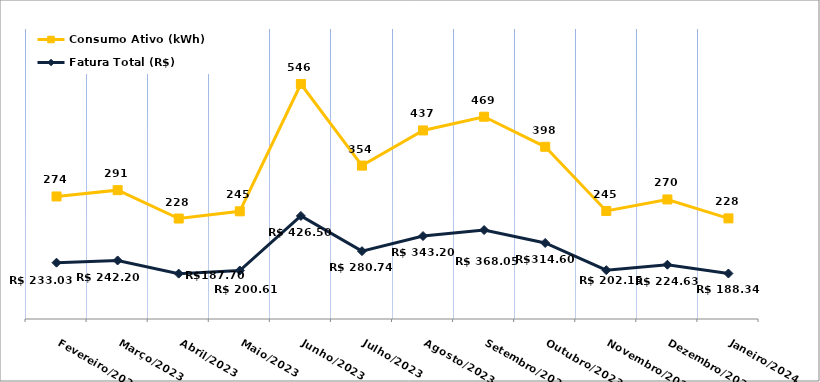
| Category | Fatura Total (R$) | Consumo Ativo (kWh) |
|---|---|---|
| Fevereiro/2023 | 233.03 | 274 |
| Março/2023 | 242.2 | 291 |
| Abril/2023 | 187.7 | 228 |
| Maio/2023 | 200.61 | 245 |
| Junho/2023 | 426.5 | 546 |
| Julho/2023 | 280.74 | 354 |
| Agosto/2023 | 343.2 | 437 |
| Setembro/2023 | 368.05 | 469 |
| Outubro/2023 | 314.6 | 398 |
| Novembro/2023 | 202.15 | 245 |
| Dezembro/2023 | 224.63 | 270 |
| Janeiro/2024 | 188.34 | 228 |